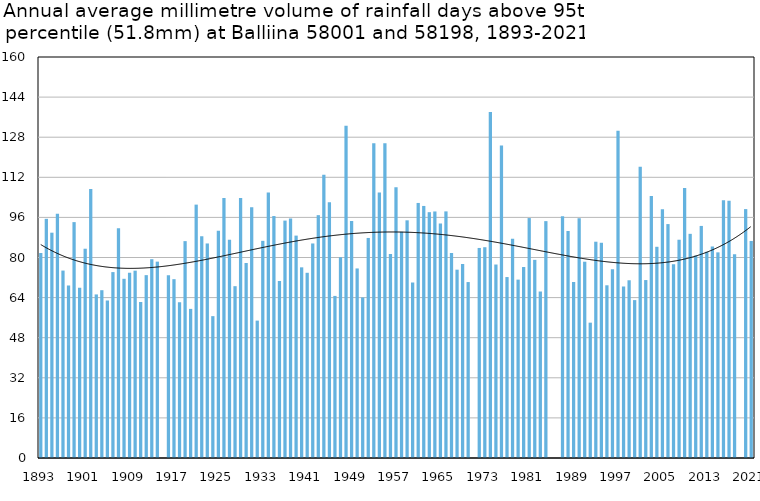
| Category | Annual average mm in days above 95th percentile |
|---|---|
| 1893 | 81.791 |
| 1894 | 95.429 |
| 1895 | 89.9 |
| 1896 | 97.5 |
| 1897 | 74.786 |
| 1898 | 68.867 |
| 1899 | 94.118 |
| 1900 | 67.95 |
| 1901 | 83.5 |
| 1902 | 107.367 |
| 1903 | 65.267 |
| 1904 | 66.95 |
| 1905 | 62.875 |
| 1906 | 74.175 |
| 1907 | 91.7 |
| 1908 | 71.5 |
| 1909 | 73.92 |
| 1910 | 74.75 |
| 1911 | 62.25 |
| 1912 | 72.962 |
| 1913 | 79.325 |
| 1914 | 78.35 |
| 1915 | 0 |
| 1916 | 72.967 |
| 1917 | 71.35 |
| 1918 | 62.125 |
| 1919 | 86.533 |
| 1920 | 59.5 |
| 1921 | 101.1 |
| 1922 | 88.48 |
| 1923 | 85.6 |
| 1924 | 56.6 |
| 1925 | 90.715 |
| 1926 | 103.7 |
| 1927 | 87.036 |
| 1928 | 68.56 |
| 1929 | 103.691 |
| 1930 | 77.8 |
| 1931 | 100.056 |
| 1932 | 54.82 |
| 1933 | 86.65 |
| 1934 | 105.95 |
| 1935 | 96.543 |
| 1936 | 70.6 |
| 1937 | 94.725 |
| 1938 | 95.562 |
| 1939 | 88.738 |
| 1940 | 76.075 |
| 1941 | 73.9 |
| 1942 | 85.6 |
| 1943 | 96.9 |
| 1944 | 113.033 |
| 1945 | 102.088 |
| 1946 | 64.671 |
| 1947 | 80.1 |
| 1948 | 132.543 |
| 1949 | 94.6 |
| 1950 | 75.631 |
| 1951 | 64.067 |
| 1952 | 87.8 |
| 1953 | 125.633 |
| 1954 | 105.9 |
| 1955 | 125.567 |
| 1956 | 81.433 |
| 1957 | 108 |
| 1958 | 90.225 |
| 1959 | 94.833 |
| 1960 | 70.025 |
| 1961 | 101.767 |
| 1962 | 100.573 |
| 1963 | 98.082 |
| 1964 | 98.367 |
| 1965 | 93.567 |
| 1966 | 98.4 |
| 1967 | 81.791 |
| 1968 | 75.14 |
| 1969 | 77.4 |
| 1970 | 70.2 |
| 1971 | 0 |
| 1972 | 83.808 |
| 1973 | 84.1 |
| 1974 | 138.1 |
| 1975 | 77.2 |
| 1976 | 124.68 |
| 1977 | 72.2 |
| 1978 | 87.5 |
| 1979 | 71.171 |
| 1980 | 76.2 |
| 1981 | 95.733 |
| 1982 | 79.06 |
| 1983 | 66.429 |
| 1984 | 94.514 |
| 1985 | 0 |
| 1986 | 0 |
| 1987 | 96.425 |
| 1988 | 90.583 |
| 1989 | 70.25 |
| 1990 | 95.667 |
| 1991 | 78.322 |
| 1992 | 54 |
| 1993 | 86.3 |
| 1994 | 85.88 |
| 1995 | 68.914 |
| 1996 | 75.3 |
| 1997 | 130.6 |
| 1998 | 68.467 |
| 1999 | 70.917 |
| 2000 | 63 |
| 2001 | 116.2 |
| 2002 | 71 |
| 2003 | 104.571 |
| 2004 | 84.273 |
| 2005 | 99.25 |
| 2006 | 93.333 |
| 2007 | 77.267 |
| 2008 | 87.091 |
| 2009 | 107.7 |
| 2010 | 89.444 |
| 2011 | 80.76 |
| 2012 | 92.6 |
| 2013 | 82.267 |
| 2014 | 84.35 |
| 2015 | 82.057 |
| 2016 | 102.8 |
| 2017 | 102.6 |
| 2018 | 81.32 |
| 2019 | 0 |
| 2020 | 99.311 |
| 2021 | 86.6 |